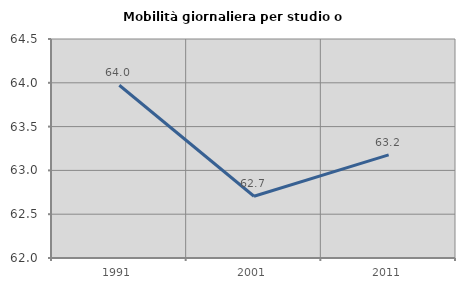
| Category | Mobilità giornaliera per studio o lavoro |
|---|---|
| 1991.0 | 63.972 |
| 2001.0 | 62.705 |
| 2011.0 | 63.177 |